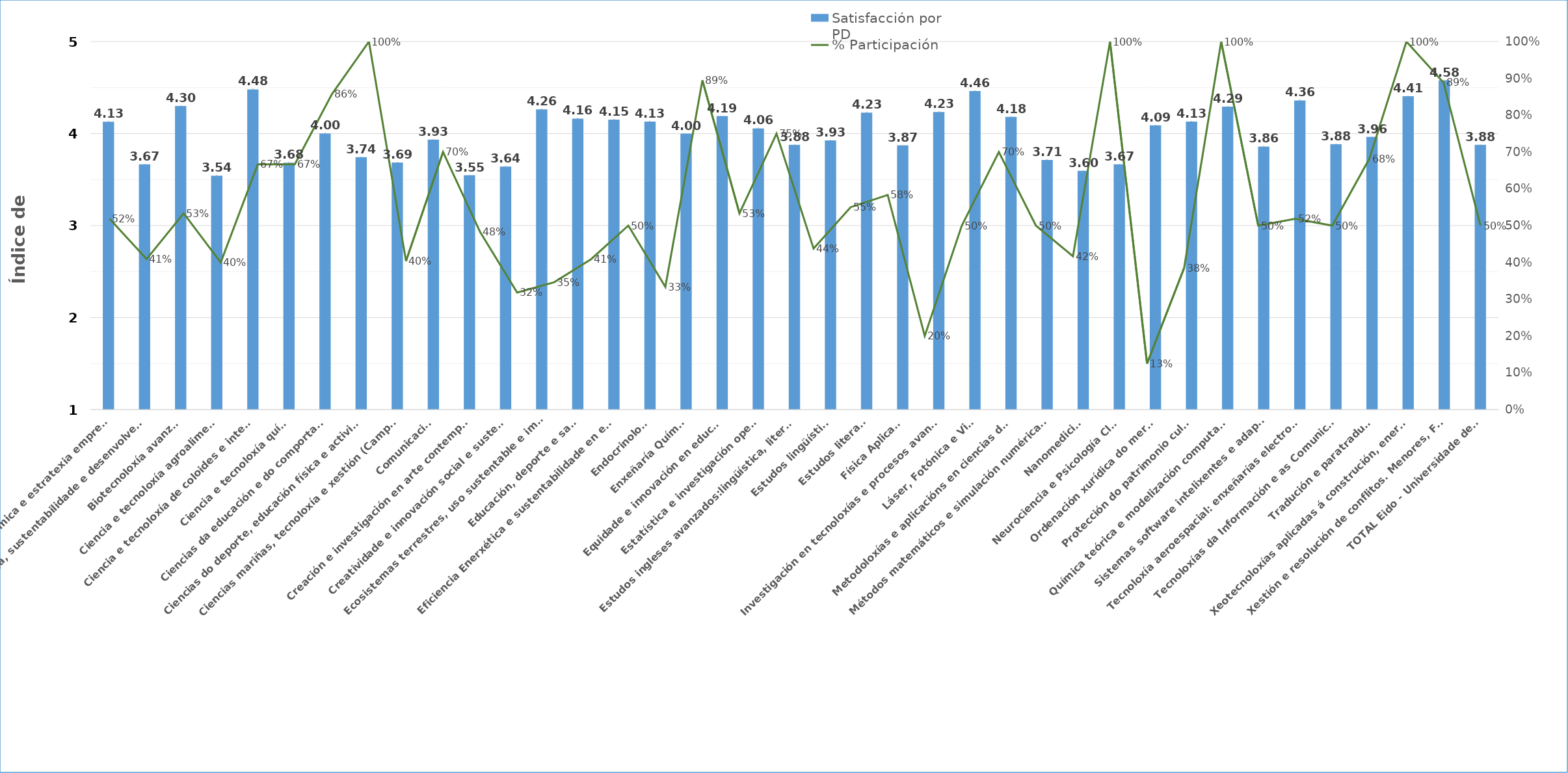
| Category | Satisfacción por PD |
|---|---|
| Análise económica e estratexia empresarial | 4.128 |
| Auga, sustentabilidade e desenvolvemento | 3.667 |
| Biotecnoloxía avanzada | 4.3 |
| Ciencia e tecnoloxía agroalimentaria | 3.543 |
| Ciencia e tecnoloxía de coloides e interfaces | 4.481 |
| Ciencia e tecnoloxía química | 3.683 |
| Ciencias da educación e do comportamiento | 4.002 |
| Ciencias do deporte, educación física e actividade física saudable | 3.744 |
| Ciencias mariñas, tecnoloxía e xestión (Campus do Mar) | 3.686 |
| Comunicación | 3.934 |
| Creación e investigación en arte contemporánea | 3.547 |
| Creatividade e innovación social e sustentable | 3.641 |
| Ecosistemas terrestres, uso sustentable e implicacións ambientais | 4.263 |
| Educación, deporte e saúde | 4.163 |
| Eficiencia Enerxética e sustentabilidade en enxeñaría e arquitectura | 4.151 |
| Endocrinoloxía | 4.131 |
| Enxeñaría Química | 3.999 |
| Equidade e innovación en educación | 4.19 |
| Estatística e investigación operativa | 4.057 |
| Estudos ingleses avanzados:lingüística, literatura e cultura | 3.877 |
| Estudos lingüísticos | 3.925 |
| Estudos literarios | 4.228 |
| Física Aplicada | 3.873 |
| Investigación en tecnoloxías e procesos avanzados na industria | 4.234 |
| Láser, Fotónica e Visión | 4.464 |
| Metodoloxías e aplicacións en ciencias da vida | 4.181 |
| Métodos matemáticos e simulación numérica en enxeñaría e ciencias aplicadas | 3.713 |
| Nanomedicina | 3.595 |
| Neurociencia e Psicología Clínica | 3.667 |
| Ordenación xurídica do mercado | 4.09 |
| Protección do patrimonio cultural | 4.131 |
| Química teórica e modelización computacional | 4.294 |
| Sistemas software intelixentes e adaptables | 3.859 |
| Tecnoloxía aeroespacial: enxeñarías electromagnética, electrónica, informática e mecánica | 4.361 |
| Tecnoloxías da Información e as Comunicacións | 3.885 |
| Tradución e paratradución | 3.964 |
| Xeotecnoloxías aplicadas á construción, enerxía e industria | 4.406 |
| Xestión e resolución de conflitos. Menores, Familia e Xusticia terapéutica | 4.579 |
| TOTAL Eido - Universidade de Vigo | 3.878 |